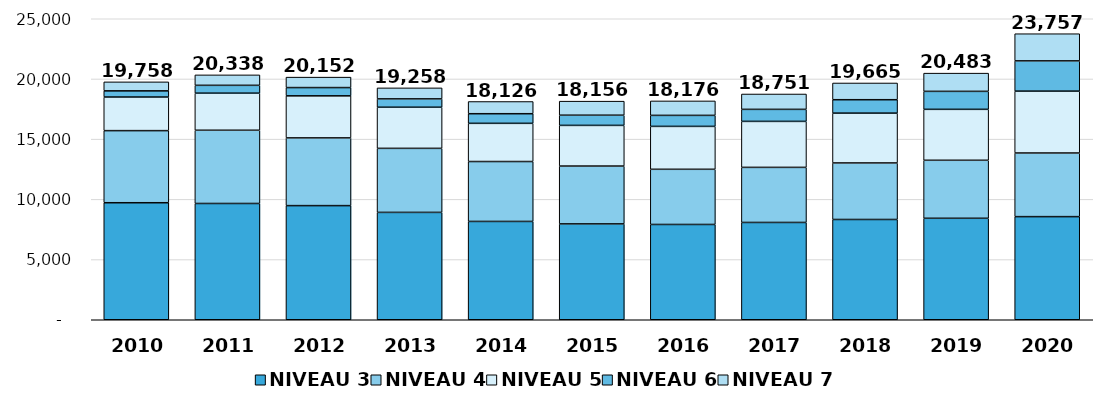
| Category | NIVEAU 3 | NIVEAU 4 | NIVEAU 5 | NIVEAU 6 | NIVEAU 7 | Series 5 |
|---|---|---|---|---|---|---|
| 2010 | 9719 | 5988 | 2792 | 512 | 747 | 19758 |
| 2011 | 9657 | 6083 | 3080 | 651 | 867 | 20338 |
| 2012 | 9480 | 5624 | 3493 | 687 | 868 | 20152 |
| 2013 | 8917 | 5319 | 3415 | 694 | 913 | 19258 |
| 2014 | 8166 | 4976 | 3171 | 800 | 1013 | 18126 |
| 2015 | 7961 | 4805 | 3378 | 845 | 1167 | 18156 |
| 2016 | 7914 | 4583 | 3563 | 915 | 1201 | 18176 |
| 2017 | 8082 | 4574 | 3820 | 999 | 1276 | 18751 |
| 2018 | 8328 | 4696 | 4138 | 1114 | 1389 | 19665 |
| 2019 | 8428 | 4817 | 4231 | 1494 | 1513 | 20483 |
| 2020 | 8565 | 5285 | 5140 | 2511 | 2256 | 23757 |